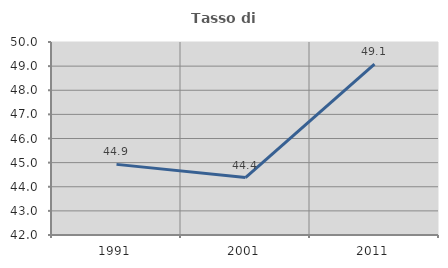
| Category | Tasso di occupazione   |
|---|---|
| 1991.0 | 44.928 |
| 2001.0 | 44.379 |
| 2011.0 | 49.08 |